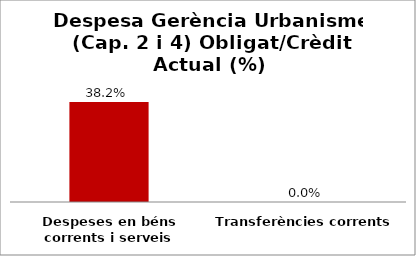
| Category | Series 0 |
|---|---|
| Despeses en béns corrents i serveis | 0.382 |
| Transferències corrents | 0 |